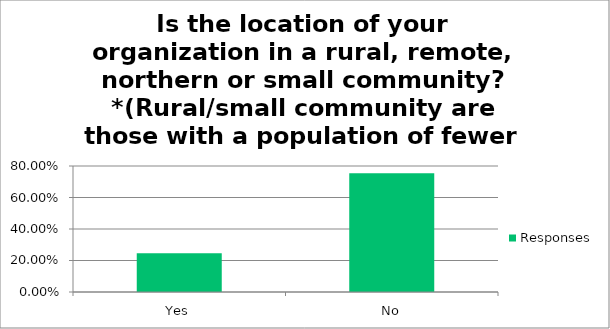
| Category | Responses |
|---|---|
| Yes | 0.246 |
| No | 0.754 |